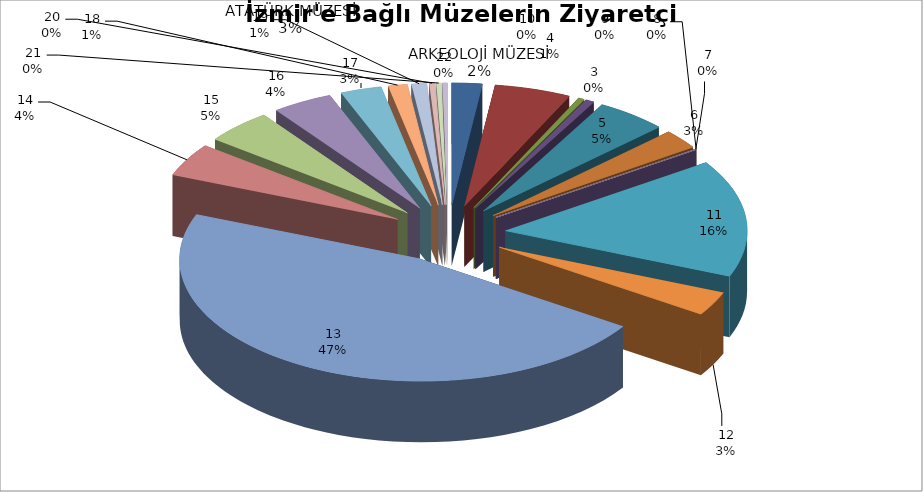
| Category | Series 0 |
|---|---|
| 0 | 29330 |
| 1 | 74246 |
| 2 | 6023 |
| 3 | 8590 |
| 4 | 69260 |
| 5 | 37348 |
| 6 | 770 |
| 7 | 0 |
| 8 | 0 |
| 9 | 0 |
| 10 | 225567 |
| 11 | 46024 |
| 12 | 677296 |
| 13 | 63524 |
| 14 | 65813 |
| 15 | 58697 |
| 16 | 39832 |
| 17 | 18599 |
| 18 | 14688 |
| 19 | 5528 |
| 20 | 4718 |
| 21 | 4756 |